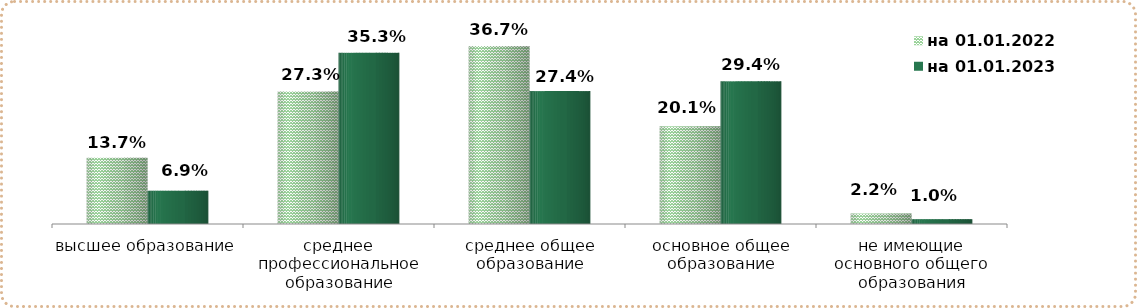
| Category | на 01.01.2022 | на 01.01.2023 |
|---|---|---|
| высшее образование | 0.137 | 0.069 |
| среднее профессиональное образование | 0.273 | 0.353 |
| среднее общее образование | 0.367 | 0.274 |
| основное общее образование | 0.201 | 0.294 |
| не имеющие основного общего образования | 0.022 | 0.01 |